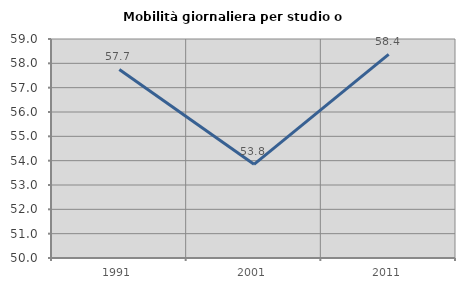
| Category | Mobilità giornaliera per studio o lavoro |
|---|---|
| 1991.0 | 57.748 |
| 2001.0 | 53.849 |
| 2011.0 | 58.371 |